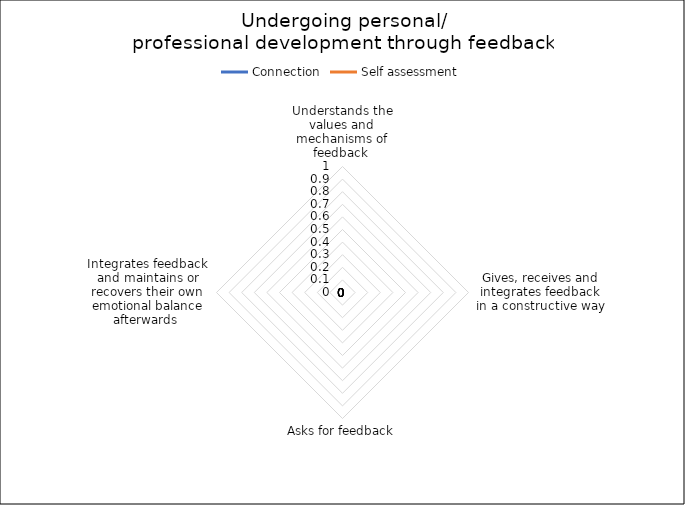
| Category | Connection | Self assessment |
|---|---|---|
| Understands the values and mechanisms of feedback  | 0 | 0 |
| Gives, receives and integrates feedback in a constructive way | 0 | 0 |
| Asks for feedback | 0 | 0 |
| Integrates feedback and maintains or recovers their own emotional balance afterwards  | 0 | 0 |